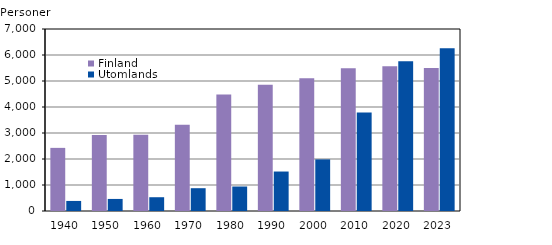
| Category | Finland  | Utomlands |
|---|---|---|
| 1940.0 | 2428 | 387 |
| 1950.0 | 2926 | 464 |
| 1960.0 | 2930 | 530 |
| 1970.0 | 3316 | 877 |
| 1980.0 | 4477 | 942 |
| 1990.0 | 4857 | 1518 |
| 2000.0 | 5109 | 1985 |
| 2010.0 | 5490 | 3785 |
| 2020.0 | 5564 | 5758 |
| 2023.0 | 5503 | 6263 |